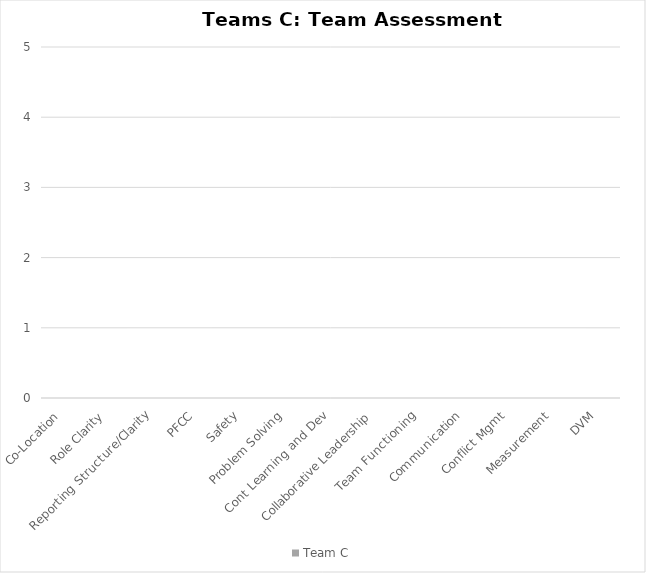
| Category | Team C |
|---|---|
| Co-Location | 0 |
| Role Clarity | 0 |
| Reporting Structure/Clarity | 0 |
| PFCC | 0 |
| Safety | 0 |
| Problem Solving | 0 |
| Cont Learning and Dev | 0 |
| Collaborative Leadership | 0 |
| Team Functioning | 0 |
| Communication | 0 |
| Conflict Mgmt | 0 |
| Measurement | 0 |
| DVM | 0 |